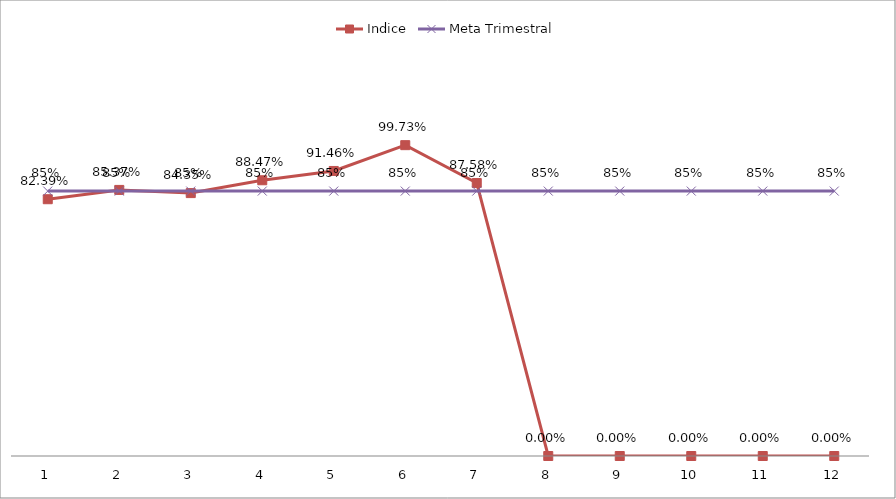
| Category | Indice | Meta Trimestral |
|---|---|---|
| 0 | 0.824 | 0.85 |
| 1 | 0.854 | 0.85 |
| 2 | 0.844 | 0.85 |
| 3 | 0.885 | 0.85 |
| 4 | 0.915 | 0.85 |
| 5 | 0.997 | 0.85 |
| 6 | 0.876 | 0.85 |
| 7 | 0 | 0.85 |
| 8 | 0 | 0.85 |
| 9 | 0 | 0.85 |
| 10 | 0 | 0.85 |
| 11 | 0 | 0.85 |